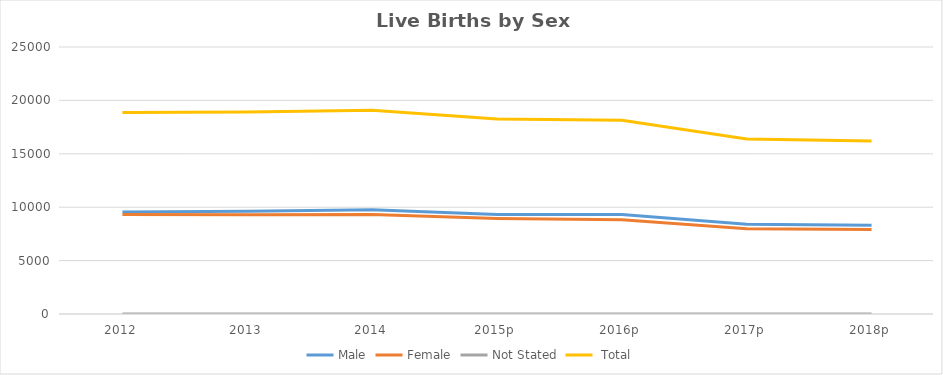
| Category | Male | Female | Not Stated |  Total |
|---|---|---|---|---|
| 2012 | 9544 | 9321 | 1 | 18866 |
| 2013 | 9618 | 9293 | 2 | 18913 |
| 2014 | 9759 | 9314 | 1 | 19074 |
| 2015p | 9309 | 8952 | 0 | 18261 |
| 2016p | 9311 | 8831 | 0 | 18142 |
| 2017p | 8400 | 7988 | 0 | 16388 |
| 2018p | 8305 | 7904 | 1 | 16210 |